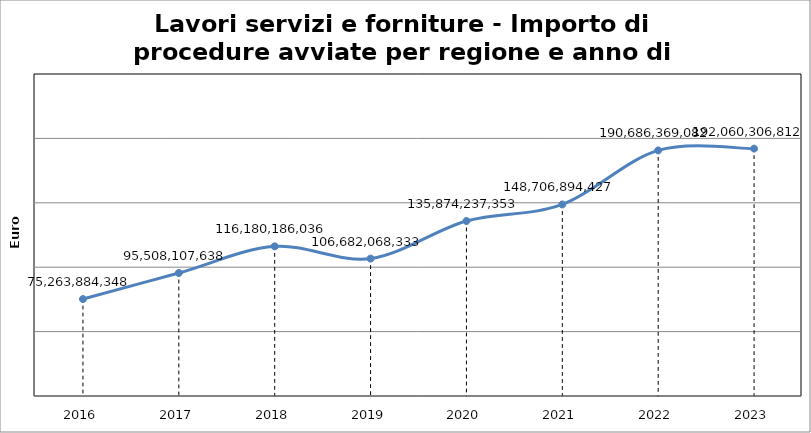
| Category | Series 0 |
|---|---|
| 2016.0 | 75263884348 |
| 2017.0 | 95508107638 |
| 2018.0 | 116180186036 |
| 2019.0 | 106682068333 |
| 2020.0 | 135874237353 |
| 2021.0 | 148706894427 |
| 2022.0 | 190686369082 |
| 2023.0 | 192060306812 |